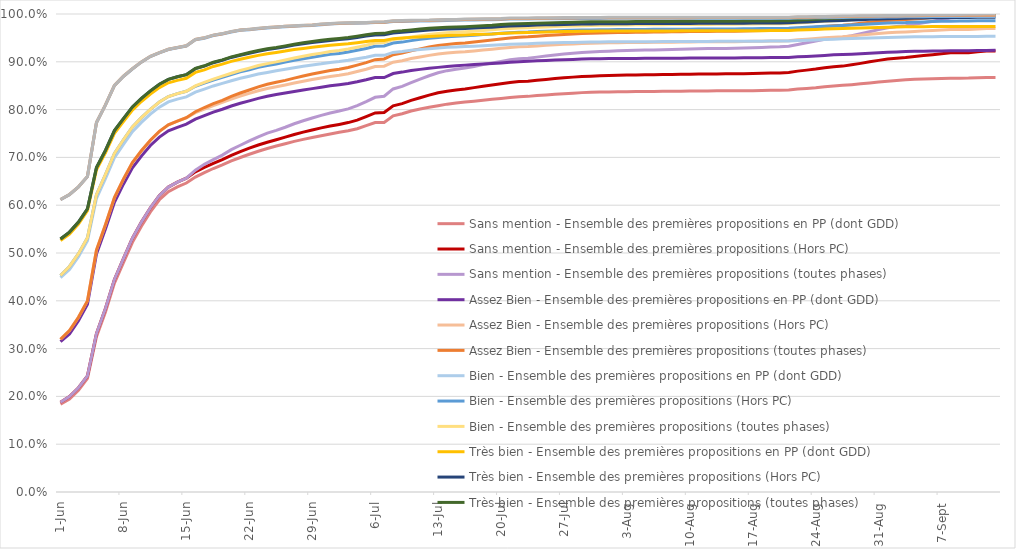
| Category | Sans mention - | Assez Bien - | Bien - | Très bien - | Très Bien avec Félicitations du Jury - |
|---|---|---|---|---|---|
| 2023-06-01 | 0.188 | 0.32 | 0.453 | 0.529 | 0.612 |
| 2023-06-02 | 0.2 | 0.338 | 0.472 | 0.544 | 0.622 |
| 2023-06-03 | 0.218 | 0.365 | 0.499 | 0.565 | 0.638 |
| 2023-06-04 | 0.243 | 0.4 | 0.532 | 0.593 | 0.66 |
| 2023-06-05 | 0.331 | 0.506 | 0.622 | 0.679 | 0.773 |
| 2023-06-06 | 0.384 | 0.559 | 0.664 | 0.715 | 0.81 |
| 2023-06-07 | 0.445 | 0.616 | 0.708 | 0.756 | 0.851 |
| 2023-06-08 | 0.488 | 0.655 | 0.737 | 0.781 | 0.87 |
| 2023-06-09 | 0.531 | 0.689 | 0.764 | 0.806 | 0.886 |
| 2023-06-10 | 0.565 | 0.714 | 0.783 | 0.823 | 0.9 |
| 2023-06-11 | 0.595 | 0.736 | 0.801 | 0.839 | 0.912 |
| 2023-06-12 | 0.62 | 0.754 | 0.816 | 0.853 | 0.919 |
| 2023-06-13 | 0.638 | 0.768 | 0.827 | 0.863 | 0.926 |
| 2023-06-14 | 0.648 | 0.776 | 0.834 | 0.869 | 0.93 |
| 2023-06-15 | 0.657 | 0.783 | 0.838 | 0.873 | 0.934 |
| 2023-06-16 | 0.673 | 0.796 | 0.85 | 0.886 | 0.947 |
| 2023-06-17 | 0.686 | 0.804 | 0.857 | 0.892 | 0.95 |
| 2023-06-18 | 0.695 | 0.812 | 0.864 | 0.899 | 0.956 |
| 2023-06-19 | 0.705 | 0.819 | 0.87 | 0.904 | 0.959 |
| 2023-06-20 | 0.716 | 0.828 | 0.876 | 0.91 | 0.963 |
| 2023-06-21 | 0.725 | 0.835 | 0.882 | 0.915 | 0.967 |
| 2023-06-22 | 0.735 | 0.841 | 0.887 | 0.919 | 0.968 |
| 2023-06-23 | 0.743 | 0.848 | 0.892 | 0.924 | 0.97 |
| 2023-06-24 | 0.751 | 0.853 | 0.896 | 0.927 | 0.972 |
| 2023-06-25 | 0.757 | 0.857 | 0.9 | 0.93 | 0.973 |
| 2023-06-26 | 0.763 | 0.861 | 0.904 | 0.933 | 0.974 |
| 2023-06-27 | 0.77 | 0.866 | 0.908 | 0.937 | 0.975 |
| 2023-06-28 | 0.777 | 0.87 | 0.912 | 0.94 | 0.976 |
| 2023-06-29 | 0.782 | 0.874 | 0.915 | 0.942 | 0.977 |
| 2023-06-30 | 0.788 | 0.878 | 0.918 | 0.945 | 0.979 |
| 2023-07-01 | 0.793 | 0.882 | 0.921 | 0.947 | 0.98 |
| 2023-07-02 | 0.797 | 0.884 | 0.924 | 0.949 | 0.981 |
| 2023-07-03 | 0.802 | 0.888 | 0.927 | 0.951 | 0.982 |
| 2023-07-04 | 0.808 | 0.893 | 0.931 | 0.954 | 0.982 |
| 2023-07-05 | 0.817 | 0.898 | 0.935 | 0.957 | 0.982 |
| 2023-07-06 | 0.826 | 0.905 | 0.939 | 0.959 | 0.983 |
| 2023-07-07 | 0.828 | 0.906 | 0.94 | 0.959 | 0.984 |
| 2023-07-08 | 0.843 | 0.915 | 0.947 | 0.964 | 0.986 |
| 2023-07-09 | 0.849 | 0.918 | 0.949 | 0.965 | 0.986 |
| 2023-07-10 | 0.856 | 0.923 | 0.952 | 0.967 | 0.987 |
| 2023-07-11 | 0.864 | 0.927 | 0.955 | 0.969 | 0.987 |
| 2023-07-12 | 0.871 | 0.931 | 0.957 | 0.97 | 0.987 |
| 2023-07-13 | 0.877 | 0.934 | 0.959 | 0.971 | 0.988 |
| 2023-07-14 | 0.881 | 0.936 | 0.961 | 0.972 | 0.989 |
| 2023-07-15 | 0.884 | 0.938 | 0.962 | 0.973 | 0.989 |
| 2023-07-16 | 0.887 | 0.94 | 0.963 | 0.974 | 0.989 |
| 2023-07-17 | 0.89 | 0.941 | 0.964 | 0.974 | 0.99 |
| 2023-07-18 | 0.894 | 0.944 | 0.966 | 0.975 | 0.99 |
| 2023-07-19 | 0.898 | 0.946 | 0.967 | 0.976 | 0.99 |
| 2023-07-20 | 0.901 | 0.948 | 0.968 | 0.978 | 0.99 |
| 2023-07-21 | 0.904 | 0.95 | 0.97 | 0.979 | 0.991 |
| 2023-07-22 | 0.906 | 0.951 | 0.971 | 0.98 | 0.992 |
| 2023-07-23 | 0.908 | 0.952 | 0.971 | 0.98 | 0.992 |
| 2023-07-24 | 0.91 | 0.954 | 0.972 | 0.981 | 0.992 |
| 2023-07-25 | 0.912 | 0.955 | 0.973 | 0.981 | 0.992 |
| 2023-07-26 | 0.914 | 0.956 | 0.974 | 0.982 | 0.992 |
| 2023-07-27 | 0.916 | 0.957 | 0.974 | 0.982 | 0.992 |
| 2023-07-28 | 0.918 | 0.958 | 0.975 | 0.983 | 0.993 |
| 2023-07-29 | 0.919 | 0.959 | 0.976 | 0.983 | 0.993 |
| 2023-07-30 | 0.921 | 0.96 | 0.976 | 0.984 | 0.993 |
| 2023-07-31 | 0.921 | 0.96 | 0.976 | 0.984 | 0.993 |
| 2023-08-01 | 0.922 | 0.961 | 0.977 | 0.984 | 0.993 |
| 2023-08-02 | 0.923 | 0.961 | 0.977 | 0.984 | 0.993 |
| 2023-08-03 | 0.924 | 0.962 | 0.977 | 0.984 | 0.993 |
| 2023-08-04 | 0.924 | 0.962 | 0.977 | 0.984 | 0.993 |
| 2023-08-05 | 0.925 | 0.962 | 0.977 | 0.984 | 0.993 |
| 2023-08-06 | 0.925 | 0.962 | 0.977 | 0.984 | 0.993 |
| 2023-08-07 | 0.925 | 0.962 | 0.978 | 0.984 | 0.993 |
| 2023-08-08 | 0.926 | 0.963 | 0.978 | 0.984 | 0.993 |
| 2023-08-09 | 0.926 | 0.963 | 0.978 | 0.985 | 0.993 |
| 2023-08-10 | 0.927 | 0.963 | 0.978 | 0.985 | 0.993 |
| 2023-08-11 | 0.927 | 0.963 | 0.978 | 0.985 | 0.993 |
| 2023-08-12 | 0.928 | 0.964 | 0.978 | 0.985 | 0.993 |
| 2023-08-13 | 0.928 | 0.964 | 0.978 | 0.985 | 0.993 |
| 2023-08-14 | 0.928 | 0.964 | 0.979 | 0.985 | 0.993 |
| 2023-08-15 | 0.928 | 0.964 | 0.979 | 0.985 | 0.993 |
| 2023-08-16 | 0.929 | 0.964 | 0.979 | 0.985 | 0.993 |
| 2023-08-17 | 0.93 | 0.965 | 0.979 | 0.985 | 0.993 |
| 2023-08-18 | 0.93 | 0.965 | 0.979 | 0.985 | 0.993 |
| 2023-08-19 | 0.931 | 0.966 | 0.98 | 0.986 | 0.993 |
| 2023-08-20 | 0.931 | 0.966 | 0.98 | 0.986 | 0.993 |
| 2023-08-21 | 0.933 | 0.966 | 0.98 | 0.986 | 0.993 |
| 2023-08-22 | 0.936 | 0.969 | 0.981 | 0.987 | 0.994 |
| 2023-08-23 | 0.94 | 0.97 | 0.982 | 0.988 | 0.994 |
| 2023-08-24 | 0.944 | 0.972 | 0.984 | 0.989 | 0.995 |
| 2023-08-25 | 0.947 | 0.974 | 0.985 | 0.99 | 0.995 |
| 2023-08-26 | 0.95 | 0.976 | 0.986 | 0.991 | 0.995 |
| 2023-08-27 | 0.951 | 0.977 | 0.987 | 0.992 | 0.996 |
| 2023-08-28 | 0.954 | 0.978 | 0.988 | 0.992 | 0.996 |
| 2023-08-29 | 0.959 | 0.981 | 0.989 | 0.993 | 0.996 |
| 2023-08-30 | 0.963 | 0.983 | 0.99 | 0.994 | 0.996 |
| 2023-08-31 | 0.967 | 0.985 | 0.991 | 0.995 | 0.997 |
| 2023-09-01 | 0.971 | 0.986 | 0.992 | 0.996 | 0.997 |
| 2023-09-02 | 0.974 | 0.988 | 0.993 | 0.996 | 0.997 |
| 2023-09-03 | 0.976 | 0.989 | 0.994 | 0.996 | 0.997 |
| 2023-09-04 | 0.978 | 0.99 | 0.994 | 0.997 | 0.997 |
| 2023-09-05 | 0.982 | 0.991 | 0.995 | 0.997 | 0.998 |
| 2023-09-06 | 0.985 | 0.993 | 0.996 | 0.998 | 0.998 |
| 2023-09-07 | 0.988 | 0.994 | 0.997 | 0.998 | 0.998 |
| 2023-09-08 | 0.992 | 0.996 | 0.998 | 0.999 | 0.999 |
| 2023-09-09 | 0.993 | 0.996 | 0.998 | 0.999 | 0.999 |
| 2023-09-10 | 0.994 | 0.997 | 0.998 | 0.999 | 0.999 |
| 2023-09-11 | 0.996 | 0.998 | 0.999 | 0.999 | 0.999 |
| 2023-09-12 | 0.999 | 1 | 1 | 1 | 1 |
| 2023-09-13 | 1 | 1 | 1 | 1 | 1 |